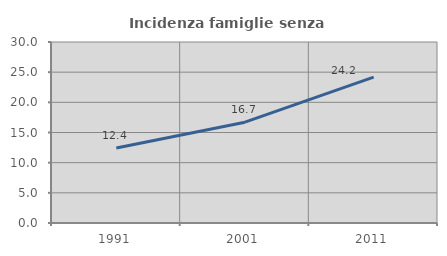
| Category | Incidenza famiglie senza nuclei |
|---|---|
| 1991.0 | 12.416 |
| 2001.0 | 16.708 |
| 2011.0 | 24.167 |